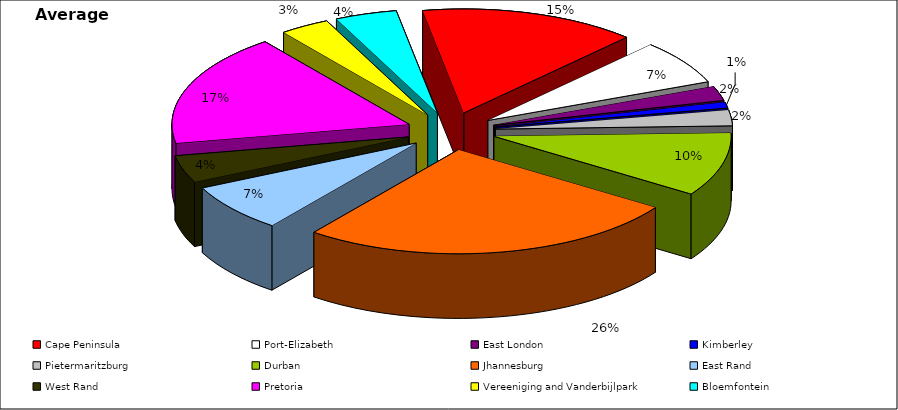
| Category | Average 2008 |
|---|---|
| Cape Peninsula | 9764.25 |
| Port-Elizabeth | 4539.5 |
| East London | 1462.75 |
| Kimberley | 603 |
| Pietermaritzburg | 1607 |
| Durban | 6507.667 |
| Jhannesburg | 17155.75 |
| East Rand | 4921.667 |
| West Rand | 2784.167 |
| Pretoria | 11532 |
| Vereeniging and Vanderbijlpark | 2238.25 |
| Bloemfontein | 2781.167 |